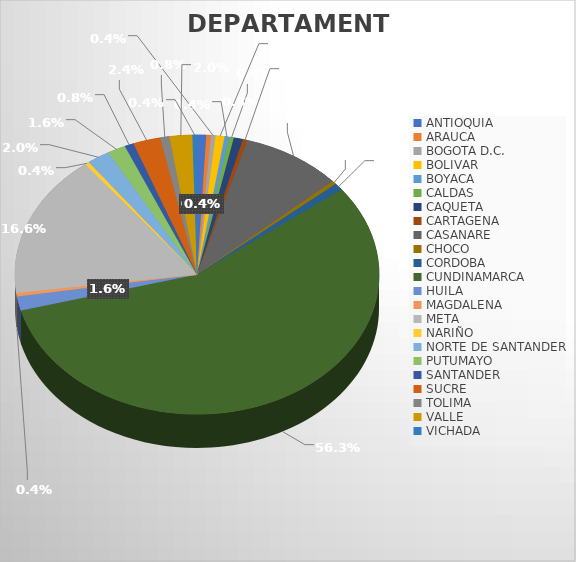
| Category | CANTIDAD |
|---|---|
| ANTIOQUIA | 2 |
| ARAUCA | 1 |
| BOGOTA D.C. | 1 |
| BOLIVAR | 2 |
| BOYACA | 1 |
| CALDAS | 1 |
| CAQUETA | 2 |
| CARTAGENA | 1 |
| CASANARE | 22 |
| CHOCO | 1 |
| CORDOBA | 2 |
| CUNDINAMARCA | 139 |
| HUILA | 4 |
| MAGDALENA | 1 |
| META | 41 |
| NARIÑO | 1 |
| NORTE DE SANTANDER | 5 |
| PUTUMAYO | 4 |
| SANTANDER | 2 |
| SUCRE | 6 |
| TOLIMA | 2 |
| VALLE | 5 |
| VICHADA | 1 |